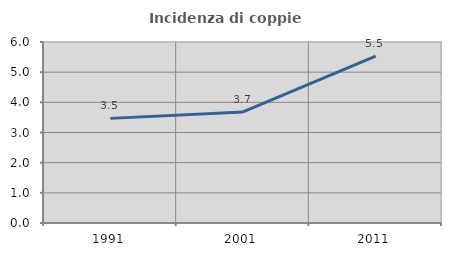
| Category | Incidenza di coppie miste |
|---|---|
| 1991.0 | 3.468 |
| 2001.0 | 3.681 |
| 2011.0 | 5.53 |